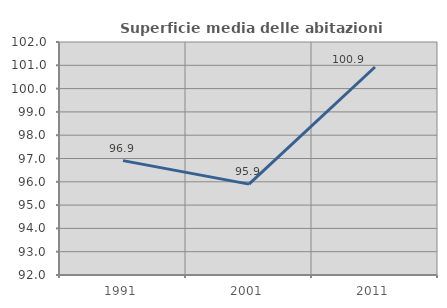
| Category | Superficie media delle abitazioni occupate |
|---|---|
| 1991.0 | 96.91 |
| 2001.0 | 95.9 |
| 2011.0 | 100.926 |